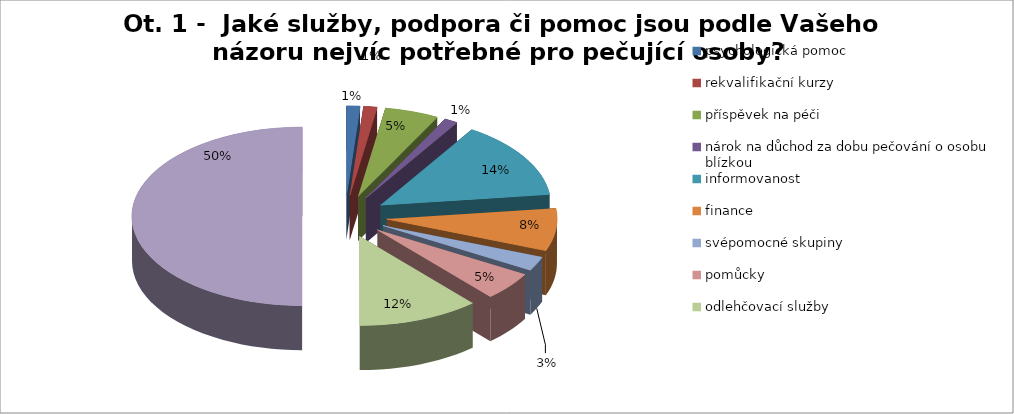
| Category | Ot. 1 -  jaké služby, podpora či pomoc jsou podle Vašeho názoru nejvíc potřebné pro pečující osoby? proc |
|---|---|
| psychologická pomoc | 0.026 |
| rekvalifikační kurzy | 0.026 |
| příspěvek na péči | 0.103 |
| nárok na důchod za dobu pečování o osobu blízkou | 0.026 |
| informovanost | 0.282 |
| finance | 0.154 |
| svépomocné skupiny | 0.051 |
| pomůcky | 0.103 |
| odlehčovací služby | 0.231 |
| celkem společných odpovědí | 1 |